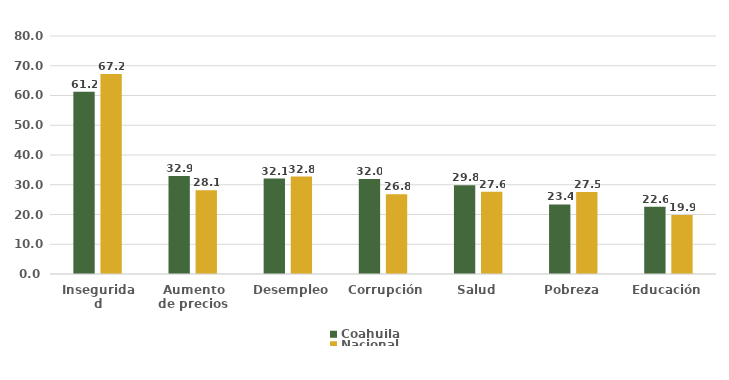
| Category | Coahuila | Nacional  |
|---|---|---|
| Inseguridad | 61.22 | 67.241 |
| Aumento de precios | 32.919 | 28.14 |
| Desempleo | 32.086 | 32.756 |
| Corrupción | 31.963 | 26.805 |
| Salud | 29.8 | 27.648 |
| Pobreza | 23.377 | 27.526 |
| Educación | 22.583 | 19.853 |